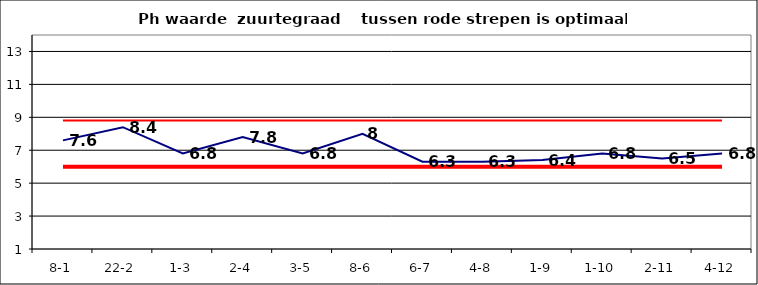
| Category | Series 0 | Series 1 | Series 2 |
|---|---|---|---|
| 8-1 | 7.6 | 6 | 8.8 |
| 22-2 | 8.4 | 6 | 8.8 |
| 1-3 | 6.8 | 6 | 8.8 |
| 2-4 | 7.8 | 6 | 8.8 |
| 3-5 | 6.8 | 6 | 8.8 |
| 8-6 | 8 | 6 | 8.8 |
| 6-7 | 6.3 | 6 | 8.8 |
| 4-8 | 6.3 | 6 | 8.8 |
| 1-9 | 6.4 | 6 | 8.8 |
| 1-10 | 6.8 | 6 | 8.8 |
| 2-11 | 6.5 | 6 | 8.8 |
| 4-12 | 6.8 | 6 | 8.8 |